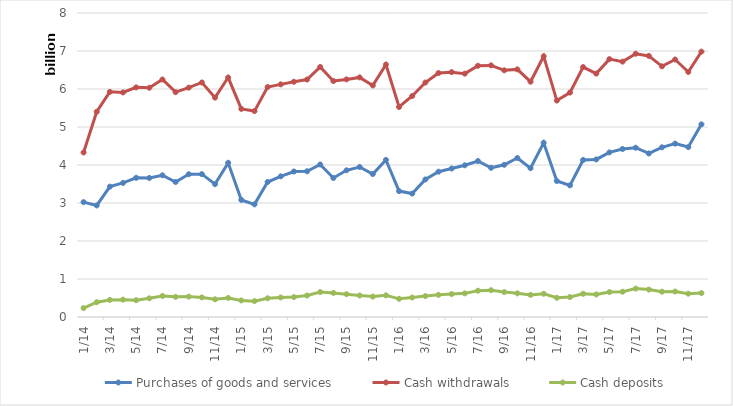
| Category | Purchases of goods and services | Cash withdrawals | Cash deposits |
|---|---|---|---|
| 2014-01-01 | 3022416360 | 4329221413 | 234202602 |
| 2014-02-01 | 2935573003 | 5400579592 | 389374332 |
| 2014-03-01 | 3430519343 | 5924330695 | 449812040 |
| 2014-04-01 | 3528683474 | 5909541153 | 456423871 |
| 2014-05-01 | 3662184878 | 6043024513 | 442083625 |
| 2014-06-01 | 3659241623 | 6032844340 | 491917835 |
| 2014-07-01 | 3729356428 | 6249956104 | 554333811 |
| 2014-08-01 | 3553475749 | 5916947506 | 529898018 |
| 2014-09-01 | 3756830312 | 6036217833 | 537264756 |
| 2014-10-01 | 3759695479 | 6171709747 | 515847868 |
| 2014-11-01 | 3496662715 | 5773259979 | 465332686 |
| 2014-12-01 | 4056822940 | 6301275832 | 501845433 |
| 2015-01-01 | 3080564316 | 5476843516 | 436617439 |
| 2015-02-01 | 2964313470 | 5418434882 | 417287822 |
| 2015-03-01 | 3552104565 | 6052489543 | 492464658 |
| 2015-04-01 | 3702068050 | 6122379943 | 514337992 |
| 2015-05-01 | 3828574763 | 6190017708 | 524095603 |
| 2015-06-01 | 3835521387 | 6248662051 | 565129556 |
| 2015-07-01 | 4012894534 | 6579631148 | 656316630 |
| 2015-08-01 | 3658519203 | 6209743784 | 633884976 |
| 2015-09-01 | 3859902726 | 6252505593 | 600857451 |
| 2015-10-01 | 3947769268 | 6305183969 | 566211452 |
| 2015-11-01 | 3762645579 | 6093796652 | 536946459 |
| 2015-12-01 | 4134324224 | 6641008685 | 570373441 |
| 2016-01-01 | 3313356181 | 5526440661 | 477949973 |
| 2016-02-01 | 3248269214 | 5816226861 | 512324963 |
| 2016-03-01 | 3619679238 | 6169984547 | 549662940 |
| 2016-04-01 | 3823999818 | 6419433107 | 582376393 |
| 2016-05-01 | 3907500543 | 6443747480 | 604150152 |
| 2016-06-01 | 3992803732 | 6404009850 | 622163959 |
| 2016-07-01 | 4104443392 | 6611263838 | 691690069 |
| 2016-08-01 | 3925959988 | 6621351165 | 705232805 |
| 2016-09-01 | 4005295393 | 6491524452 | 655447842 |
| 2016-10-01 | 4184310295 | 6516178632 | 622806180 |
| 2016-11-01 | 3916622974 | 6192076994 | 581315199 |
| 2016-12-01 | 4585676699 | 6860960168 | 612347745 |
| 2017-01-01 | 3579431859 | 5695813057 | 505971477 |
| 2017-02-01 | 3465062471 | 5905650526 | 524298023 |
| 2017-03-01 | 4132110078 | 6576518594 | 610672899 |
| 2017-04-01 | 4146194627 | 6405698115 | 593283764 |
| 2017-05-01 | 4331545466 | 6786132607 | 656245703 |
| 2017-06-01 | 4420401084 | 6720272792 | 665286210 |
| 2017-07-01 | 4454191914 | 6928847609 | 747986708 |
| 2017-08-01 | 4303812338 | 6870895799 | 721612254 |
| 2017-09-01 | 4466017428 | 6596491946 | 666343648 |
| 2017-10-01 | 4562095306 | 6775597691 | 671478223 |
| 2017-11-01 | 4472506453 | 6447912948 | 614247461 |
| 2017-12-01 | 5070421627 | 6983850032 | 629795691 |